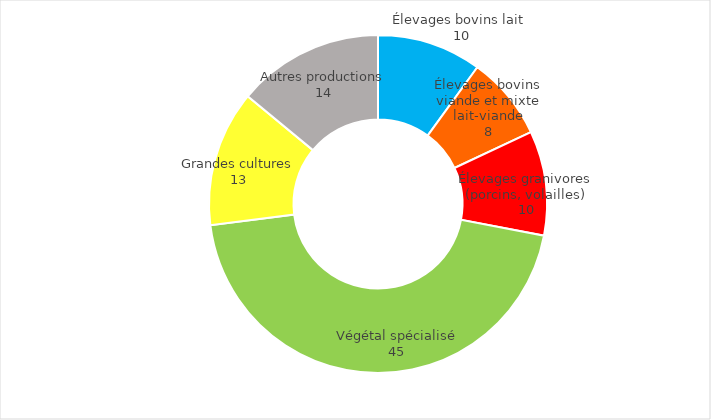
| Category | Series 0 |
|---|---|
| Élevages bovins lait  | 10 |
| Élevages bovins viande et mixte lait-viande | 8 |
| Élevages granivores (porcins, volailles) | 10 |
| Végétal spécialisé | 45 |
| Grandes cultures | 13 |
| Autres productions | 14 |